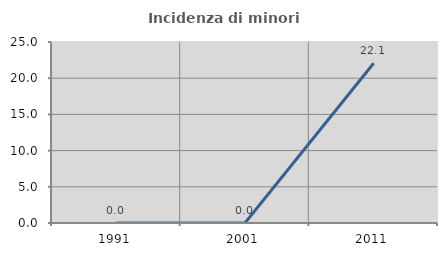
| Category | Incidenza di minori stranieri |
|---|---|
| 1991.0 | 0 |
| 2001.0 | 0 |
| 2011.0 | 22.059 |